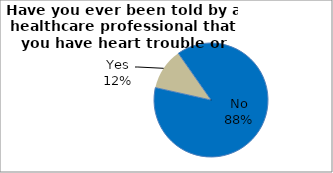
| Category | Series 0 |
|---|---|
| No | 88.218 |
| Yes | 11.782 |